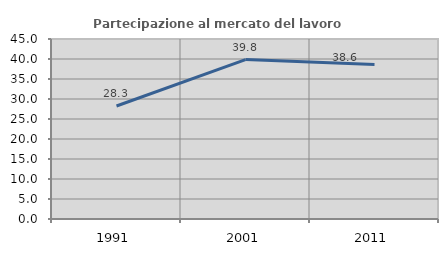
| Category | Partecipazione al mercato del lavoro  femminile |
|---|---|
| 1991.0 | 28.253 |
| 2001.0 | 39.847 |
| 2011.0 | 38.61 |